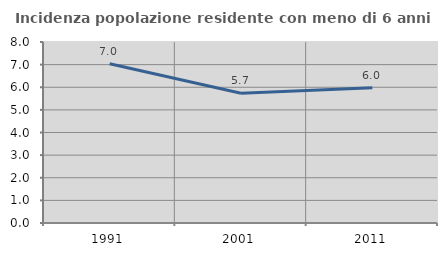
| Category | Incidenza popolazione residente con meno di 6 anni |
|---|---|
| 1991.0 | 7.036 |
| 2001.0 | 5.735 |
| 2011.0 | 5.977 |